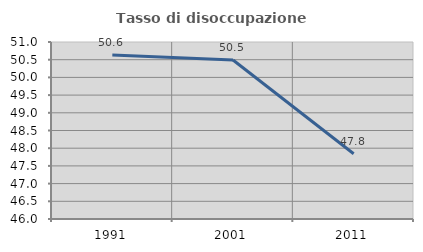
| Category | Tasso di disoccupazione giovanile  |
|---|---|
| 1991.0 | 50.632 |
| 2001.0 | 50.49 |
| 2011.0 | 47.843 |